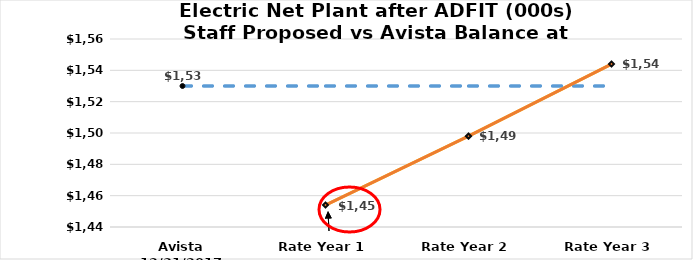
| Category | 12.31.17  | Staff |
|---|---|---|
| Avista 12/31/2017 | 1530 | 1454 |
| Rate Year 1 | 1530 | 1454 |
| Rate Year 2 | 1530 | 1498 |
| Rate Year 3 | 1530 | 1544 |